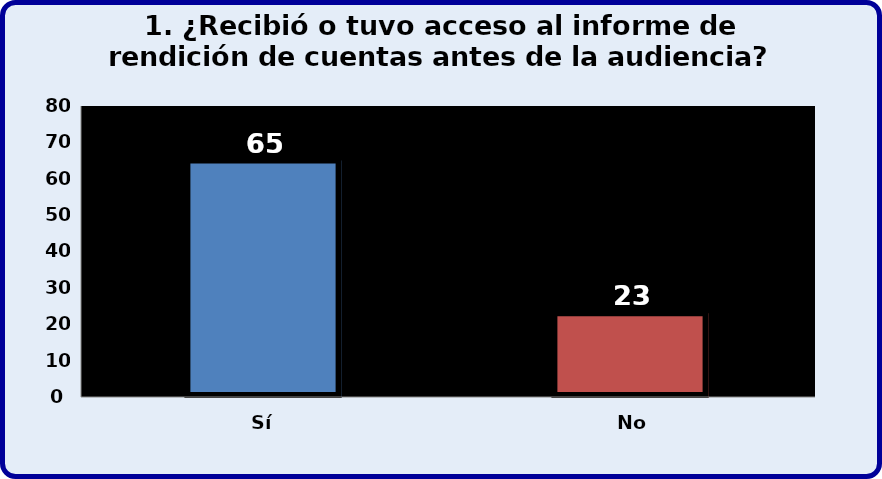
| Category | Series 0 |
|---|---|
| Sí | 65 |
| No | 23 |